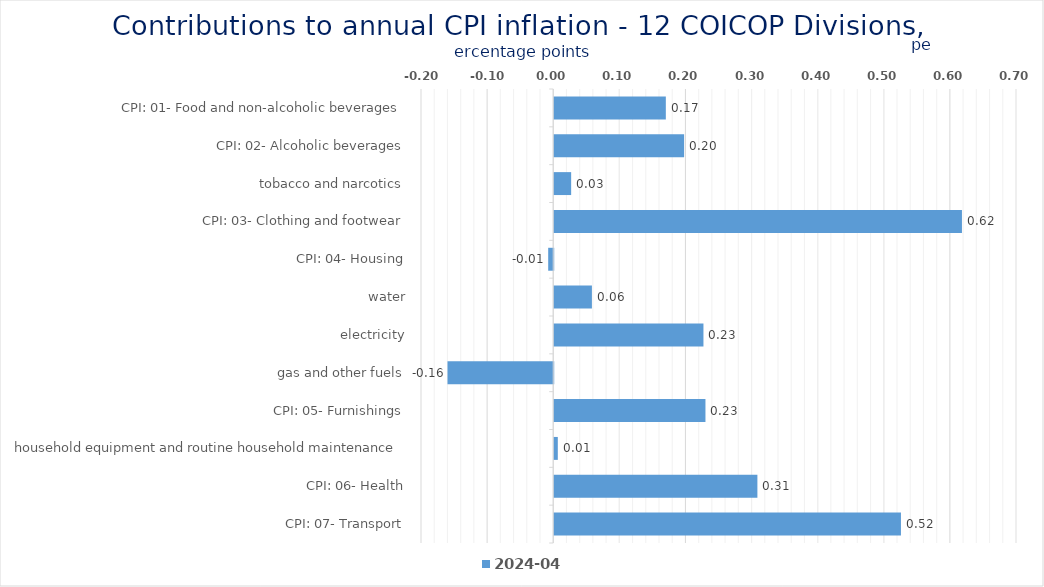
| Category | 2024-04 |
|---|---|
| CPI: 01- Food and non-alcoholic beverages | 0.169 |
| CPI: 02- Alcoholic beverages, tobacco and narcotics | 0.196 |
| CPI: 03- Clothing and footwear | 0.026 |
| CPI: 04- Housing, water, electricity, gas and other fuels | 0.617 |
| CPI: 05- Furnishings, household equipment and routine household maintenance | -0.008 |
| CPI: 06- Health | 0.057 |
| CPI: 07- Transport | 0.226 |
| CPI: 08- Communication | -0.16 |
| CPI: 09- Recreation and culture | 0.229 |
| CPI: 10- Education | 0.005 |
| CPI: 11- Restaurants and hotels | 0.307 |
| CPI: 12- Miscellaneous goods and services | 0.524 |